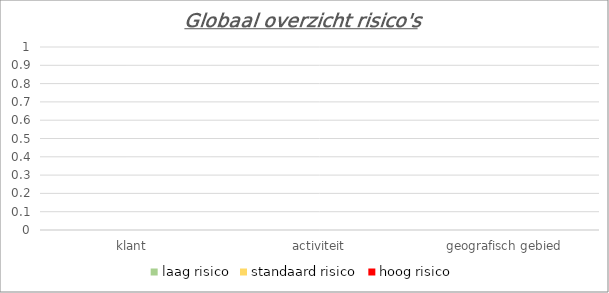
| Category | laag risico | standaard risico | hoog risico |
|---|---|---|---|
| 0 | 0 | 0 | 0 |
| 1 | 0 | 0 | 0 |
| 2 | 0 | 0 | 0 |